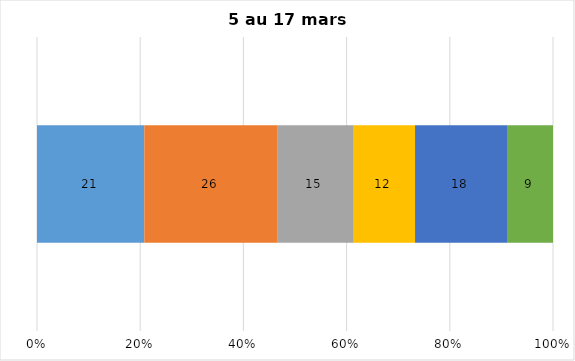
| Category | Plusieurs fois par jour | Une fois par jour | Quelques fois par semaine   | Une fois par semaine ou moins   |  Jamais   |  Je n’utilise pas les médias sociaux |
|---|---|---|---|---|---|---|
| 0 | 21 | 26 | 15 | 12 | 18 | 9 |